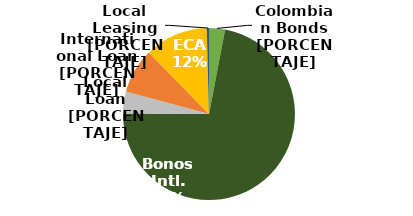
| Category | Series 0 |
|---|---|
| Bonos Locales | 0.03 |
| Bonos Intl. | 0.721 |
| Crédito Local | 0.041 |
| Crédito Intl. | 0.085 |
| ECA | 0.119 |
| Leasing Local | 0.004 |